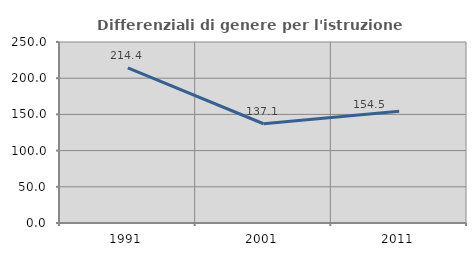
| Category | Differenziali di genere per l'istruzione superiore |
|---|---|
| 1991.0 | 214.384 |
| 2001.0 | 137.094 |
| 2011.0 | 154.47 |